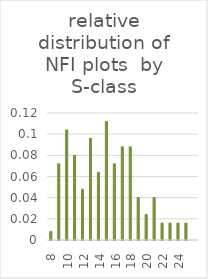
| Category | Series 0 |
|---|---|
| 8.0 | 0.008 |
| 9.0 | 0.072 |
| 10.0 | 0.104 |
| 11.0 | 0.08 |
| 12.0 | 0.048 |
| 13.0 | 0.096 |
| 14.0 | 0.064 |
| 15.0 | 0.112 |
| 16.0 | 0.072 |
| 17.0 | 0.088 |
| 18.0 | 0.088 |
| 19.0 | 0.04 |
| 20.0 | 0.024 |
| 21.0 | 0.04 |
| 22.0 | 0.016 |
| 23.0 | 0.016 |
| 24.0 | 0.016 |
| 25.0 | 0.016 |